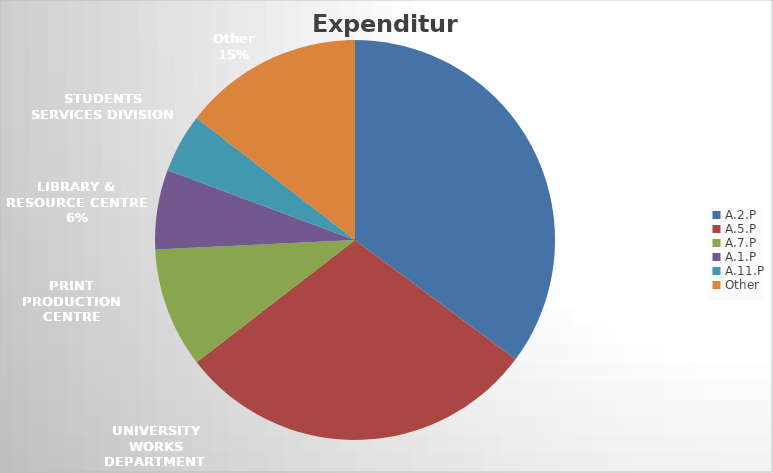
| Category | Total | Percentage |
|---|---|---|
| A.2.P | 986880000 | 35 |
| A.5.P | 824180000 | 29 |
| A.7.P | 272200000 | 10 |
| A.1.P | 180160000 | 6 |
| A.11.P | 134260000 | 5 |
| Other | 408330000 | 15 |